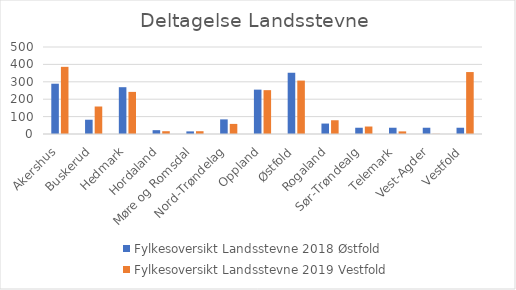
| Category | Fylkesoversikt Landsstevne |
|---|---|
| Akershus | 386 |
| Buskerud | 158 |
| Hedmark | 242 |
| Hordaland | 16 |
| Møre og Romsdal | 16 |
| Nord-Trøndelag | 58 |
| Oppland | 252 |
| Østfold | 307 |
| Rogaland | 79 |
| Sør-Trøndealg | 43 |
| Telemark | 15 |
| Vest-Agder | 1 |
| Vestfold | 356 |